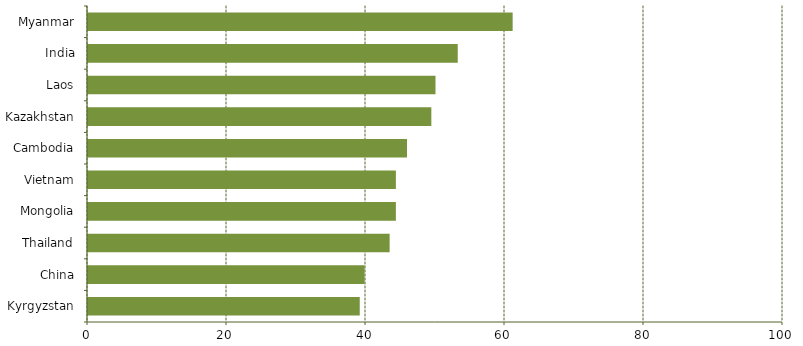
| Category | Score |
|---|---|
| Kyrgyzstan | 39.1 |
| China | 39.8 |
| Thailand | 43.4 |
| Mongolia | 44.3 |
| Vietnam | 44.3 |
| Cambodia | 45.9 |
| Kazakhstan | 49.4 |
| Laos | 50 |
| India | 53.2 |
| Myanmar | 61.1 |